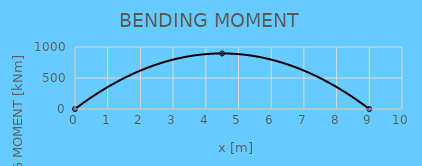
| Category | BM |
|---|---|
| 0.0 | 0 |
| 4.5 | 896.062 |
| 9.0 | 0 |